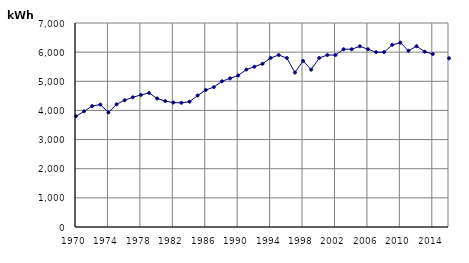
| Category | kWh |
|---|---|
| 1970 | 3800 |
| 1971 | 3970 |
| 1972 | 4150 |
| 1973 | 4200 |
| 1974 | 3930 |
| 1975 | 4210 |
| 1976 | 4350 |
| 1977 | 4450 |
| 1978 | 4530 |
| 1979 | 4600 |
| 1980 | 4410 |
| 1981 | 4320 |
| 1982 | 4270 |
| 1983 | 4260 |
| 1984 | 4300 |
| 1985 | 4510 |
| 1986 | 4700 |
| 1987 | 4800 |
| 1988 | 5000 |
| 1989 | 5100 |
| 1990 | 5200 |
| 1991 | 5400 |
| 1992 | 5500 |
| 1993 | 5600 |
| 1994 | 5800 |
| 1995 | 5900 |
| 1996 | 5800 |
| 1997 | 5300 |
| 1998 | 5700 |
| 1999 | 5400 |
| 2000 | 5800 |
| 2001 | 5900 |
| 2002 | 5900 |
| 2003 | 6100 |
| 2004 | 6100 |
| 2005 | 6200 |
| 2006 | 6100 |
| 2007 | 6000 |
| 2008 | 6000 |
| 2009 | 6249.909 |
| 2010 | 6326.873 |
| 2011 | 6047.482 |
| 2012 | 6204.612 |
| 2013 | 6014.448 |
| 2014 | 5935.345 |
| 2015 | 0 |
| 2016 | 5789.522 |